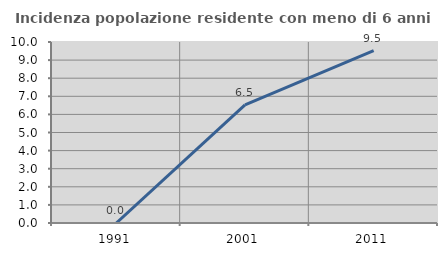
| Category | Incidenza popolazione residente con meno di 6 anni |
|---|---|
| 1991.0 | 0 |
| 2001.0 | 6.522 |
| 2011.0 | 9.524 |